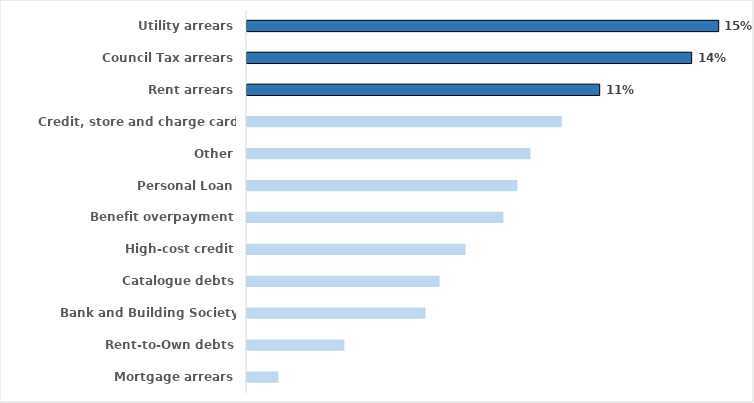
| Category | 2019/20 |
|---|---|
| Utility arrears | 0.152 |
| Council Tax arrears | 0.143 |
| Rent arrears | 0.113 |
| Credit, store and charge card debts | 0.101 |
| Other | 0.091 |
| Personal Loan | 0.087 |
| Benefit overpayment | 0.082 |
| High-cost credit | 0.07 |
| Catalogue debts | 0.062 |
| Bank and Building Society overdrafts | 0.057 |
| Rent-to-Own debts | 0.031 |
| Mortgage arrears | 0.01 |